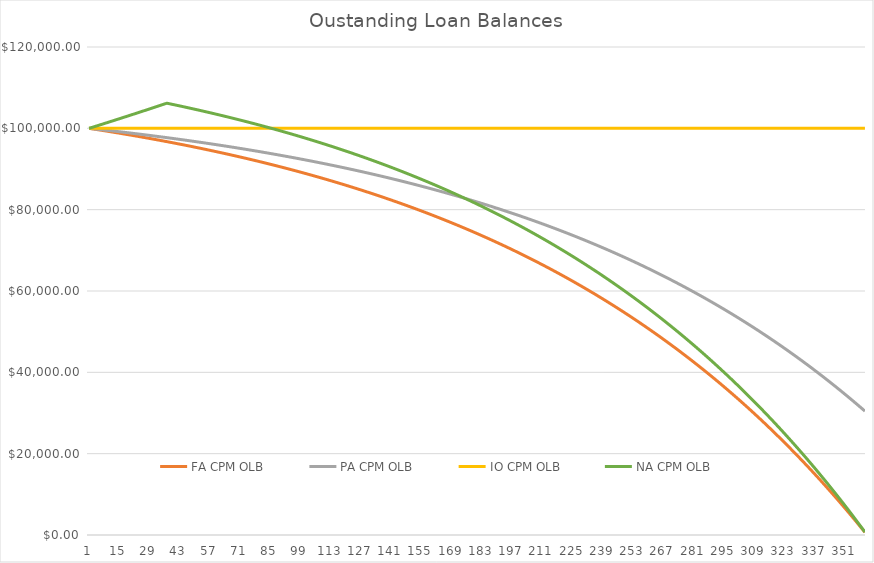
| Category | FA CPM OLB | PA CPM OLB | IO CPM OLB | NA CPM OLB |
|---|---|---|---|---|
| 0 | 100000 | 100000 | 100000 | 100000 |
| 1 | 99918.031 | 99942.622 | 100000 | 100166.667 |
| 2 | 99835.584 | 99884.908 | 100000 | 100333.611 |
| 3 | 99752.655 | 99826.859 | 100000 | 100500.834 |
| 4 | 99669.243 | 99768.47 | 100000 | 100668.335 |
| 5 | 99585.345 | 99709.741 | 100000 | 100836.116 |
| 6 | 99500.957 | 99650.67 | 100000 | 101004.176 |
| 7 | 99416.076 | 99591.254 | 100000 | 101172.516 |
| 8 | 99330.701 | 99531.491 | 100000 | 101341.137 |
| 9 | 99244.828 | 99471.379 | 100000 | 101510.039 |
| 10 | 99158.453 | 99410.917 | 100000 | 101679.222 |
| 11 | 99071.575 | 99350.103 | 100000 | 101848.688 |
| 12 | 98984.19 | 99288.933 | 100000 | 102018.436 |
| 13 | 98896.295 | 99227.407 | 100000 | 102188.466 |
| 14 | 98807.888 | 99165.522 | 100000 | 102358.78 |
| 15 | 98718.965 | 99103.275 | 100000 | 102529.378 |
| 16 | 98629.523 | 99040.666 | 100000 | 102700.261 |
| 17 | 98539.559 | 98977.692 | 100000 | 102871.428 |
| 18 | 98449.071 | 98914.35 | 100000 | 103042.88 |
| 19 | 98358.055 | 98850.638 | 100000 | 103214.618 |
| 20 | 98266.508 | 98786.555 | 100000 | 103386.643 |
| 21 | 98174.426 | 98722.098 | 100000 | 103558.954 |
| 22 | 98081.808 | 98657.266 | 100000 | 103731.552 |
| 23 | 97988.649 | 98592.055 | 100000 | 103904.438 |
| 24 | 97894.947 | 98526.463 | 100000 | 104077.612 |
| 25 | 97800.699 | 98460.489 | 100000 | 104251.075 |
| 26 | 97705.9 | 98394.13 | 100000 | 104424.826 |
| 27 | 97610.549 | 98327.384 | 100000 | 104598.868 |
| 28 | 97514.641 | 98260.249 | 100000 | 104773.199 |
| 29 | 97418.174 | 98192.722 | 100000 | 104947.821 |
| 30 | 97321.144 | 98124.801 | 100000 | 105122.734 |
| 31 | 97223.549 | 98056.484 | 100000 | 105297.939 |
| 32 | 97125.383 | 97987.768 | 100000 | 105473.435 |
| 33 | 97026.646 | 97918.652 | 100000 | 105649.224 |
| 34 | 96927.332 | 97849.132 | 100000 | 105825.307 |
| 35 | 96827.439 | 97779.207 | 100000 | 106001.682 |
| 36 | 96726.963 | 97708.874 | 100000 | 106178.351 |
| 37 | 96625.901 | 97638.131 | 100000 | 106067.415 |
| 38 | 96524.25 | 97566.975 | 100000 | 105955.831 |
| 39 | 96422.005 | 97495.404 | 100000 | 105843.596 |
| 40 | 96319.165 | 97423.415 | 100000 | 105730.706 |
| 41 | 96215.724 | 97351.007 | 100000 | 105617.158 |
| 42 | 96111.68 | 97278.176 | 100000 | 105502.948 |
| 43 | 96007.029 | 97204.92 | 100000 | 105388.071 |
| 44 | 95901.767 | 97131.237 | 100000 | 105272.524 |
| 45 | 95795.892 | 97057.124 | 100000 | 105156.303 |
| 46 | 95689.399 | 96982.579 | 100000 | 105039.405 |
| 47 | 95582.284 | 96907.599 | 100000 | 104921.824 |
| 48 | 95474.545 | 96832.182 | 100000 | 104803.557 |
| 49 | 95366.178 | 96756.324 | 100000 | 104684.601 |
| 50 | 95257.178 | 96680.024 | 100000 | 104564.95 |
| 51 | 95147.542 | 96603.279 | 100000 | 104444.602 |
| 52 | 95037.267 | 96526.087 | 100000 | 104323.552 |
| 53 | 94926.349 | 96448.444 | 100000 | 104201.795 |
| 54 | 94814.783 | 96370.348 | 100000 | 104079.328 |
| 55 | 94702.567 | 96291.797 | 100000 | 103956.147 |
| 56 | 94589.696 | 96212.787 | 100000 | 103832.248 |
| 57 | 94476.167 | 96133.317 | 100000 | 103707.625 |
| 58 | 94361.975 | 96053.383 | 100000 | 103582.276 |
| 59 | 94247.118 | 95972.982 | 100000 | 103456.195 |
| 60 | 94131.59 | 95892.113 | 100000 | 103329.379 |
| 61 | 94015.388 | 95810.772 | 100000 | 103201.823 |
| 62 | 93898.509 | 95728.956 | 100000 | 103073.523 |
| 63 | 93780.948 | 95646.663 | 100000 | 102944.475 |
| 64 | 93662.701 | 95563.891 | 100000 | 102814.674 |
| 65 | 93543.764 | 95480.635 | 100000 | 102684.116 |
| 66 | 93424.133 | 95396.893 | 100000 | 102552.796 |
| 67 | 93303.805 | 95312.664 | 100000 | 102420.71 |
| 68 | 93182.775 | 95227.942 | 100000 | 102287.853 |
| 69 | 93061.038 | 95142.727 | 100000 | 102154.222 |
| 70 | 92938.592 | 95057.014 | 100000 | 102019.811 |
| 71 | 92815.431 | 94970.802 | 100000 | 101884.616 |
| 72 | 92691.552 | 94884.087 | 100000 | 101748.632 |
| 73 | 92566.95 | 94796.865 | 100000 | 101611.855 |
| 74 | 92441.622 | 94709.135 | 100000 | 101474.281 |
| 75 | 92315.562 | 94620.893 | 100000 | 101335.904 |
| 76 | 92188.767 | 94532.137 | 100000 | 101196.719 |
| 77 | 92061.232 | 94442.863 | 100000 | 101056.723 |
| 78 | 91932.954 | 94353.068 | 100000 | 100915.91 |
| 79 | 91803.927 | 94262.749 | 100000 | 100774.275 |
| 80 | 91674.147 | 94171.903 | 100000 | 100631.815 |
| 81 | 91543.611 | 94080.527 | 100000 | 100488.523 |
| 82 | 91412.312 | 93988.619 | 100000 | 100344.396 |
| 83 | 91280.248 | 93896.174 | 100000 | 100199.427 |
| 84 | 91147.414 | 93803.19 | 100000 | 100053.613 |
| 85 | 91013.805 | 93709.663 | 100000 | 99906.949 |
| 86 | 90879.416 | 93615.591 | 100000 | 99759.429 |
| 87 | 90744.244 | 93520.971 | 100000 | 99611.048 |
| 88 | 90608.283 | 93425.798 | 100000 | 99461.802 |
| 89 | 90471.528 | 93330.07 | 100000 | 99311.685 |
| 90 | 90333.976 | 93233.784 | 100000 | 99160.693 |
| 91 | 90195.622 | 93136.936 | 100000 | 99008.82 |
| 92 | 90056.461 | 93039.523 | 100000 | 98856.061 |
| 93 | 89916.488 | 92941.541 | 100000 | 98702.411 |
| 94 | 89775.698 | 92842.989 | 100000 | 98547.864 |
| 95 | 89634.087 | 92743.861 | 100000 | 98392.416 |
| 96 | 89491.65 | 92644.155 | 100000 | 98236.061 |
| 97 | 89348.382 | 92543.868 | 100000 | 98078.794 |
| 98 | 89204.279 | 92442.995 | 100000 | 97920.61 |
| 99 | 89059.334 | 92341.534 | 100000 | 97761.503 |
| 100 | 88913.545 | 92239.481 | 100000 | 97601.468 |
| 101 | 88766.905 | 92136.833 | 100000 | 97440.499 |
| 102 | 88619.409 | 92033.586 | 100000 | 97278.592 |
| 103 | 88471.053 | 91929.737 | 100000 | 97115.74 |
| 104 | 88321.832 | 91825.282 | 100000 | 96951.938 |
| 105 | 88171.74 | 91720.218 | 100000 | 96787.18 |
| 106 | 88020.773 | 91614.541 | 100000 | 96621.461 |
| 107 | 87868.925 | 91508.247 | 100000 | 96454.776 |
| 108 | 87716.191 | 91401.334 | 100000 | 96287.118 |
| 109 | 87562.566 | 91293.796 | 100000 | 96118.483 |
| 110 | 87408.045 | 91185.632 | 100000 | 95948.863 |
| 111 | 87252.623 | 91076.836 | 100000 | 95778.254 |
| 112 | 87096.294 | 90967.406 | 100000 | 95606.65 |
| 113 | 86939.053 | 90857.337 | 100000 | 95434.045 |
| 114 | 86780.895 | 90746.627 | 100000 | 95260.433 |
| 115 | 86621.815 | 90635.27 | 100000 | 95085.808 |
| 116 | 86461.806 | 90523.264 | 100000 | 94910.165 |
| 117 | 86300.864 | 90410.605 | 100000 | 94733.497 |
| 118 | 86138.983 | 90297.288 | 100000 | 94555.799 |
| 119 | 85976.158 | 90183.311 | 100000 | 94377.064 |
| 120 | 85812.383 | 90068.668 | 100000 | 94197.286 |
| 121 | 85647.653 | 89953.357 | 100000 | 94016.46 |
| 122 | 85481.962 | 89837.373 | 100000 | 93834.578 |
| 123 | 85315.304 | 89720.713 | 100000 | 93651.636 |
| 124 | 85147.674 | 89603.372 | 100000 | 93467.627 |
| 125 | 84979.067 | 89485.347 | 100000 | 93282.544 |
| 126 | 84809.475 | 89366.633 | 100000 | 93096.382 |
| 127 | 84638.895 | 89247.226 | 100000 | 92909.133 |
| 128 | 84467.319 | 89127.123 | 100000 | 92720.793 |
| 129 | 84294.743 | 89006.32 | 100000 | 92531.354 |
| 130 | 84121.16 | 88884.812 | 100000 | 92340.809 |
| 131 | 83946.564 | 88762.595 | 100000 | 92149.153 |
| 132 | 83770.95 | 88639.665 | 100000 | 91956.38 |
| 133 | 83594.311 | 88516.018 | 100000 | 91762.481 |
| 134 | 83416.642 | 88391.649 | 100000 | 91567.452 |
| 135 | 83237.937 | 88266.556 | 100000 | 91371.285 |
| 136 | 83058.189 | 88140.732 | 100000 | 91173.973 |
| 137 | 82877.392 | 88014.175 | 100000 | 90975.511 |
| 138 | 82695.541 | 87886.879 | 100000 | 90775.891 |
| 139 | 82512.629 | 87758.841 | 100000 | 90575.106 |
| 140 | 82328.651 | 87630.055 | 100000 | 90373.151 |
| 141 | 82143.599 | 87500.519 | 100000 | 90170.017 |
| 142 | 81957.467 | 87370.227 | 100000 | 89965.698 |
| 143 | 81770.25 | 87239.175 | 100000 | 89760.187 |
| 144 | 81581.94 | 87107.358 | 100000 | 89553.478 |
| 145 | 81392.533 | 86974.773 | 100000 | 89345.563 |
| 146 | 81202.02 | 86841.414 | 100000 | 89136.434 |
| 147 | 81010.396 | 86707.277 | 100000 | 88926.086 |
| 148 | 80817.654 | 86572.358 | 100000 | 88714.511 |
| 149 | 80623.788 | 86436.651 | 100000 | 88501.702 |
| 150 | 80428.791 | 86300.154 | 100000 | 88287.652 |
| 151 | 80232.656 | 86162.859 | 100000 | 88072.352 |
| 152 | 80035.378 | 86024.764 | 100000 | 87855.797 |
| 153 | 79836.948 | 85885.864 | 100000 | 87637.979 |
| 154 | 79637.361 | 85746.153 | 100000 | 87418.89 |
| 155 | 79436.61 | 85605.627 | 100000 | 87198.523 |
| 156 | 79234.688 | 85464.281 | 100000 | 86976.87 |
| 157 | 79031.587 | 85322.111 | 100000 | 86753.925 |
| 158 | 78827.303 | 85179.112 | 100000 | 86529.679 |
| 159 | 78621.826 | 85035.278 | 100000 | 86304.125 |
| 160 | 78415.151 | 84890.606 | 100000 | 86077.255 |
| 161 | 78207.27 | 84745.089 | 100000 | 85849.062 |
| 162 | 77998.177 | 84598.724 | 100000 | 85619.537 |
| 163 | 77787.863 | 84451.504 | 100000 | 85388.674 |
| 164 | 77576.324 | 84303.426 | 100000 | 85156.464 |
| 165 | 77363.55 | 84154.485 | 100000 | 84922.899 |
| 166 | 77149.534 | 84004.674 | 100000 | 84687.972 |
| 167 | 76934.271 | 83853.99 | 100000 | 84451.675 |
| 168 | 76717.752 | 83702.426 | 100000 | 84213.999 |
| 169 | 76499.969 | 83549.979 | 100000 | 83974.937 |
| 170 | 76280.917 | 83396.642 | 100000 | 83734.48 |
| 171 | 76060.586 | 83242.41 | 100000 | 83492.621 |
| 172 | 75838.97 | 83087.279 | 100000 | 83249.351 |
| 173 | 75616.062 | 82931.243 | 100000 | 83004.661 |
| 174 | 75391.853 | 82774.297 | 100000 | 82758.545 |
| 175 | 75166.336 | 82616.436 | 100000 | 82510.992 |
| 176 | 74939.504 | 82457.653 | 100000 | 82261.996 |
| 177 | 74711.349 | 82297.944 | 100000 | 82011.547 |
| 178 | 74481.863 | 82137.304 | 100000 | 81759.637 |
| 179 | 74251.038 | 81975.726 | 100000 | 81506.258 |
| 180 | 74018.866 | 81813.206 | 100000 | 81251.4 |
| 181 | 73785.34 | 81649.738 | 100000 | 80995.056 |
| 182 | 73550.452 | 81485.317 | 100000 | 80737.217 |
| 183 | 73314.194 | 81319.936 | 100000 | 80477.873 |
| 184 | 73076.558 | 81153.591 | 100000 | 80217.017 |
| 185 | 72837.535 | 80986.275 | 100000 | 79954.639 |
| 186 | 72597.118 | 80817.983 | 100000 | 79690.731 |
| 187 | 72355.299 | 80648.709 | 100000 | 79425.283 |
| 188 | 72112.069 | 80478.448 | 100000 | 79158.286 |
| 189 | 71867.42 | 80307.194 | 100000 | 78889.732 |
| 190 | 71621.345 | 80134.941 | 100000 | 78619.612 |
| 191 | 71373.833 | 79961.683 | 100000 | 78347.916 |
| 192 | 71124.878 | 79787.415 | 100000 | 78074.635 |
| 193 | 70874.471 | 79612.13 | 100000 | 77799.759 |
| 194 | 70622.603 | 79435.822 | 100000 | 77523.281 |
| 195 | 70369.265 | 79258.486 | 100000 | 77245.189 |
| 196 | 70114.45 | 79080.115 | 100000 | 76965.476 |
| 197 | 69858.149 | 78900.704 | 100000 | 76684.131 |
| 198 | 69600.352 | 78720.246 | 100000 | 76401.144 |
| 199 | 69341.052 | 78538.736 | 100000 | 76116.507 |
| 200 | 69080.239 | 78356.167 | 100000 | 75830.209 |
| 201 | 68817.904 | 78172.533 | 100000 | 75542.242 |
| 202 | 68554.039 | 77987.828 | 100000 | 75252.594 |
| 203 | 68288.636 | 77802.045 | 100000 | 74961.257 |
| 204 | 68021.683 | 77615.178 | 100000 | 74668.22 |
| 205 | 67753.174 | 77427.222 | 100000 | 74373.475 |
| 206 | 67483.098 | 77238.169 | 100000 | 74077.009 |
| 207 | 67211.447 | 77048.013 | 100000 | 73778.815 |
| 208 | 66938.212 | 76856.748 | 100000 | 73478.88 |
| 209 | 66663.382 | 76664.367 | 100000 | 73177.197 |
| 210 | 66386.949 | 76470.864 | 100000 | 72873.753 |
| 211 | 66108.904 | 76276.233 | 100000 | 72568.539 |
| 212 | 65829.237 | 76080.466 | 100000 | 72261.545 |
| 213 | 65547.938 | 75883.557 | 100000 | 71952.761 |
| 214 | 65264.999 | 75685.499 | 100000 | 71642.174 |
| 215 | 64980.409 | 75486.286 | 100000 | 71329.777 |
| 216 | 64694.158 | 75285.911 | 100000 | 71015.556 |
| 217 | 64406.239 | 75084.367 | 100000 | 70699.503 |
| 218 | 64116.639 | 74881.647 | 100000 | 70381.606 |
| 219 | 63825.35 | 74677.745 | 100000 | 70061.855 |
| 220 | 63532.362 | 74472.654 | 100000 | 69740.239 |
| 221 | 63237.665 | 74266.366 | 100000 | 69416.746 |
| 222 | 62941.249 | 74058.874 | 100000 | 69091.367 |
| 223 | 62643.104 | 73850.173 | 100000 | 68764.089 |
| 224 | 62343.22 | 73640.254 | 100000 | 68434.902 |
| 225 | 62041.586 | 73429.11 | 100000 | 68103.796 |
| 226 | 61738.193 | 73216.735 | 100000 | 67770.757 |
| 227 | 61433.03 | 73003.121 | 100000 | 67435.776 |
| 228 | 61126.086 | 72788.261 | 100000 | 67098.841 |
| 229 | 60817.353 | 72572.147 | 100000 | 66759.94 |
| 230 | 60506.818 | 72354.773 | 100000 | 66419.063 |
| 231 | 60194.472 | 72136.131 | 100000 | 66076.197 |
| 232 | 59880.304 | 71916.213 | 100000 | 65731.33 |
| 233 | 59564.303 | 71695.012 | 100000 | 65384.453 |
| 234 | 59246.459 | 71472.522 | 100000 | 65035.551 |
| 235 | 58926.761 | 71248.733 | 100000 | 64684.615 |
| 236 | 58605.198 | 71023.639 | 100000 | 64331.631 |
| 237 | 58281.759 | 70797.231 | 100000 | 63976.589 |
| 238 | 57956.434 | 70569.504 | 100000 | 63619.475 |
| 239 | 57629.21 | 70340.447 | 100000 | 63260.278 |
| 240 | 57300.078 | 70110.055 | 100000 | 62898.986 |
| 241 | 56969.026 | 69878.318 | 100000 | 62535.586 |
| 242 | 56636.043 | 69645.23 | 100000 | 62170.066 |
| 243 | 56301.118 | 69410.782 | 100000 | 61802.414 |
| 244 | 55964.238 | 69174.967 | 100000 | 61432.618 |
| 245 | 55625.394 | 68937.776 | 100000 | 61060.664 |
| 246 | 55284.573 | 68699.201 | 100000 | 60686.541 |
| 247 | 54941.764 | 68459.235 | 100000 | 60310.235 |
| 248 | 54596.955 | 68217.868 | 100000 | 59931.734 |
| 249 | 54250.134 | 67975.094 | 100000 | 59551.025 |
| 250 | 53901.291 | 67730.904 | 100000 | 59168.096 |
| 251 | 53550.413 | 67485.289 | 100000 | 58782.933 |
| 252 | 53197.488 | 67238.241 | 100000 | 58395.522 |
| 253 | 52842.504 | 66989.753 | 100000 | 58005.852 |
| 254 | 52485.449 | 66739.815 | 100000 | 57613.909 |
| 255 | 52126.312 | 66488.418 | 100000 | 57219.68 |
| 256 | 51765.08 | 66235.556 | 100000 | 56823.151 |
| 257 | 51401.74 | 65981.218 | 100000 | 56424.309 |
| 258 | 51036.281 | 65725.397 | 100000 | 56023.14 |
| 259 | 50668.69 | 65468.083 | 100000 | 55619.631 |
| 260 | 50298.955 | 65209.269 | 100000 | 55213.768 |
| 261 | 49927.063 | 64948.944 | 100000 | 54805.538 |
| 262 | 49553.002 | 64687.101 | 100000 | 54394.926 |
| 263 | 49176.759 | 64423.731 | 100000 | 53981.92 |
| 264 | 48798.32 | 64158.824 | 100000 | 53566.504 |
| 265 | 48417.675 | 63892.372 | 100000 | 53148.664 |
| 266 | 48034.809 | 63624.366 | 100000 | 52728.388 |
| 267 | 47649.709 | 63354.797 | 100000 | 52305.659 |
| 268 | 47262.363 | 63083.654 | 100000 | 51880.465 |
| 269 | 46872.758 | 62810.931 | 100000 | 51452.791 |
| 270 | 46480.88 | 62536.616 | 100000 | 51022.621 |
| 271 | 46086.716 | 62260.701 | 100000 | 50589.943 |
| 272 | 45690.253 | 61983.177 | 100000 | 50154.74 |
| 273 | 45291.477 | 61704.034 | 100000 | 49716.999 |
| 274 | 44890.374 | 61423.262 | 100000 | 49276.704 |
| 275 | 44486.932 | 61140.853 | 100000 | 48833.841 |
| 276 | 44081.137 | 60856.796 | 100000 | 48388.395 |
| 277 | 43672.975 | 60571.082 | 100000 | 47940.35 |
| 278 | 43262.431 | 60283.702 | 100000 | 47489.691 |
| 279 | 42849.493 | 59994.645 | 100000 | 47036.404 |
| 280 | 42434.146 | 59703.902 | 100000 | 46580.472 |
| 281 | 42016.376 | 59411.463 | 100000 | 46121.881 |
| 282 | 41596.169 | 59117.318 | 100000 | 45660.615 |
| 283 | 41173.511 | 58821.457 | 100000 | 45196.658 |
| 284 | 40748.387 | 58523.871 | 100000 | 44729.995 |
| 285 | 40320.783 | 58224.548 | 100000 | 44260.609 |
| 286 | 39890.685 | 57923.48 | 100000 | 43788.485 |
| 287 | 39458.078 | 57620.655 | 100000 | 43313.608 |
| 288 | 39022.948 | 57316.064 | 100000 | 42835.96 |
| 289 | 38585.279 | 57009.696 | 100000 | 42355.526 |
| 290 | 38145.058 | 56701.54 | 100000 | 41872.289 |
| 291 | 37702.268 | 56391.588 | 100000 | 41386.233 |
| 292 | 37256.896 | 56079.827 | 100000 | 40897.343 |
| 293 | 36808.925 | 55766.247 | 100000 | 40405.6 |
| 294 | 36358.341 | 55450.839 | 100000 | 39910.989 |
| 295 | 35905.129 | 55133.59 | 100000 | 39413.492 |
| 296 | 35449.273 | 54814.491 | 100000 | 38913.094 |
| 297 | 34990.758 | 54493.531 | 100000 | 38409.776 |
| 298 | 34529.568 | 54170.698 | 100000 | 37903.523 |
| 299 | 34065.688 | 53845.982 | 100000 | 37394.316 |
| 300 | 33599.102 | 53519.372 | 100000 | 36882.139 |
| 301 | 33129.795 | 53190.856 | 100000 | 36366.974 |
| 302 | 32657.749 | 52860.424 | 100000 | 35848.804 |
| 303 | 32182.95 | 52528.065 | 100000 | 35327.612 |
| 304 | 31705.382 | 52193.767 | 100000 | 34803.379 |
| 305 | 31225.027 | 51857.519 | 100000 | 34276.088 |
| 306 | 30741.871 | 51519.309 | 100000 | 33745.721 |
| 307 | 30255.896 | 51179.127 | 100000 | 33212.261 |
| 308 | 29767.086 | 50836.96 | 100000 | 32675.689 |
| 309 | 29275.425 | 50492.797 | 100000 | 32135.986 |
| 310 | 28780.896 | 50146.627 | 100000 | 31593.136 |
| 311 | 28283.482 | 49798.437 | 100000 | 31047.118 |
| 312 | 27783.166 | 49448.216 | 100000 | 30497.916 |
| 313 | 27279.932 | 49095.953 | 100000 | 29945.51 |
| 314 | 26773.763 | 48741.634 | 100000 | 29389.881 |
| 315 | 26264.64 | 48385.248 | 100000 | 28831.012 |
| 316 | 25752.548 | 48026.784 | 100000 | 28268.882 |
| 317 | 25237.469 | 47666.228 | 100000 | 27703.473 |
| 318 | 24719.385 | 47303.57 | 100000 | 27134.766 |
| 319 | 24198.279 | 46938.795 | 100000 | 26562.742 |
| 320 | 23674.133 | 46571.893 | 100000 | 25987.381 |
| 321 | 23146.93 | 46202.851 | 100000 | 25408.663 |
| 322 | 22616.651 | 45831.656 | 100000 | 24826.57 |
| 323 | 22083.279 | 45458.295 | 100000 | 24241.081 |
| 324 | 21546.796 | 45082.757 | 100000 | 23652.177 |
| 325 | 21007.183 | 44705.028 | 100000 | 23059.837 |
| 326 | 20464.422 | 44325.096 | 100000 | 22464.042 |
| 327 | 19918.495 | 43942.947 | 100000 | 21864.772 |
| 328 | 19369.384 | 43558.569 | 100000 | 21262.006 |
| 329 | 18817.07 | 43171.949 | 100000 | 20655.724 |
| 330 | 18261.534 | 42783.073 | 100000 | 20045.905 |
| 331 | 17702.757 | 42391.93 | 100000 | 19432.529 |
| 332 | 17140.72 | 41998.504 | 100000 | 18815.575 |
| 333 | 16575.405 | 41602.784 | 100000 | 18195.022 |
| 334 | 16006.793 | 41204.755 | 100000 | 17570.849 |
| 335 | 15434.863 | 40804.404 | 100000 | 16943.035 |
| 336 | 14859.597 | 40401.718 | 100000 | 16311.559 |
| 337 | 14280.976 | 39996.683 | 100000 | 15676.399 |
| 338 | 13698.979 | 39589.285 | 100000 | 15037.534 |
| 339 | 13113.587 | 39179.511 | 100000 | 14394.942 |
| 340 | 12524.781 | 38767.346 | 100000 | 13748.602 |
| 341 | 11932.539 | 38352.778 | 100000 | 13098.492 |
| 342 | 11336.843 | 37935.79 | 100000 | 12444.589 |
| 343 | 10737.672 | 37516.371 | 100000 | 11786.872 |
| 344 | 10135.006 | 37094.504 | 100000 | 11125.318 |
| 345 | 9528.825 | 36670.177 | 100000 | 10459.906 |
| 346 | 8919.107 | 36243.375 | 100000 | 9790.611 |
| 347 | 8305.833 | 35814.083 | 100000 | 9117.412 |
| 348 | 7688.981 | 35382.287 | 100000 | 8440.287 |
| 349 | 7068.531 | 34947.972 | 100000 | 7759.211 |
| 350 | 6444.461 | 34511.123 | 100000 | 7074.163 |
| 351 | 5816.752 | 34071.726 | 100000 | 6385.118 |
| 352 | 5185.38 | 33629.766 | 100000 | 5692.054 |
| 353 | 4550.326 | 33185.228 | 100000 | 4994.947 |
| 354 | 3911.567 | 32738.097 | 100000 | 4293.774 |
| 355 | 3269.082 | 32288.357 | 100000 | 3588.51 |
| 356 | 2622.849 | 31835.994 | 100000 | 2879.133 |
| 357 | 1972.846 | 31380.992 | 100000 | 2165.617 |
| 358 | 1319.052 | 30923.336 | 100000 | 1447.939 |
| 359 | 661.444 | 30463.011 | 100000 | 726.075 |